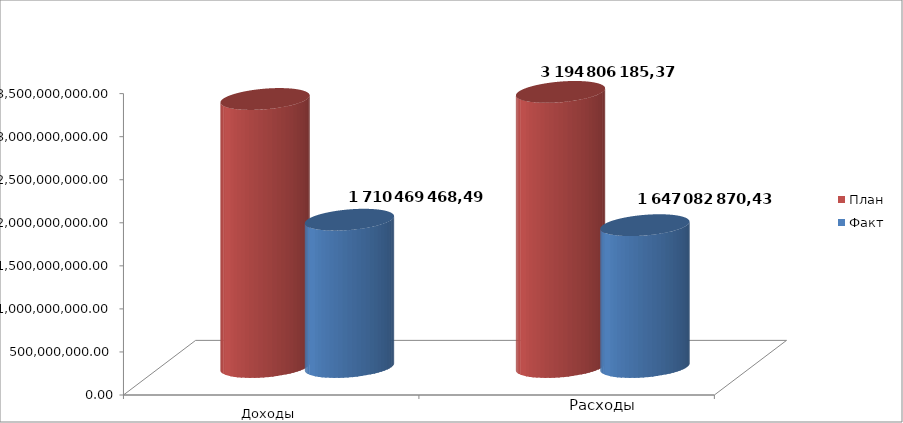
| Category | План | Факт |
|---|---|---|
| 0 | 3112473166.49 | 1710469468.49 |
| 1 | 3194806185.37 | 1647082870.43 |